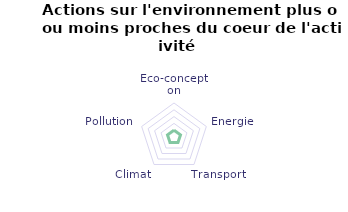
| Category | Pondération action |
|---|---|
| Eco-conception | 0 |
| Energie | 0 |
| Transport | 0 |
| Climat | 0 |
| Pollution | 0 |